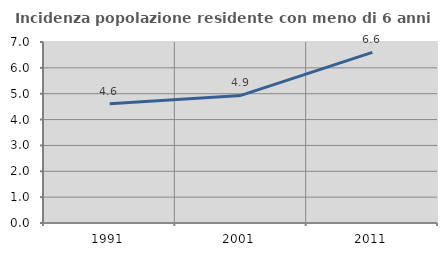
| Category | Incidenza popolazione residente con meno di 6 anni |
|---|---|
| 1991.0 | 4.611 |
| 2001.0 | 4.933 |
| 2011.0 | 6.599 |